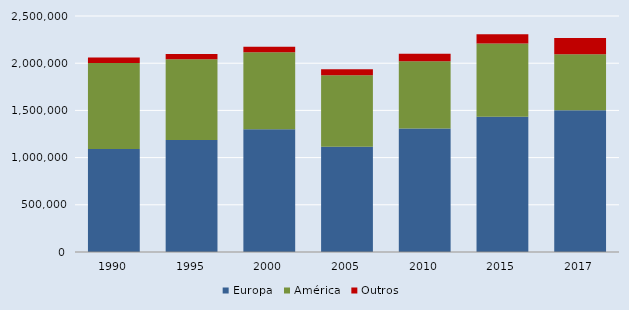
| Category | Europa | América | Outros |
|---|---|---|---|
| 1990.0 | 1092141 | 910907 | 57742 |
| 1995.0 | 1187356 | 853198 | 56635 |
| 2000.0 | 1301084 | 815315 | 58045 |
| 2005.0 | 1114618 | 758905 | 62543 |
| 2010.0 | 1308130 | 712886 | 77881 |
| 2015.0 | 1433482 | 775050 | 97789 |
| 2017.0 | 1502151 | 592642 | 171942 |